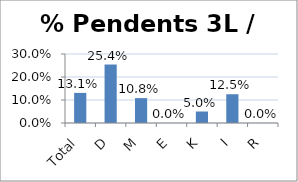
| Category | % Pendents 3L / E240 |
|---|---|
| Total | 0.131 |
| D | 0.254 |
| M | 0.108 |
| E | 0 |
| K | 0.05 |
| I | 0.125 |
| R | 0 |